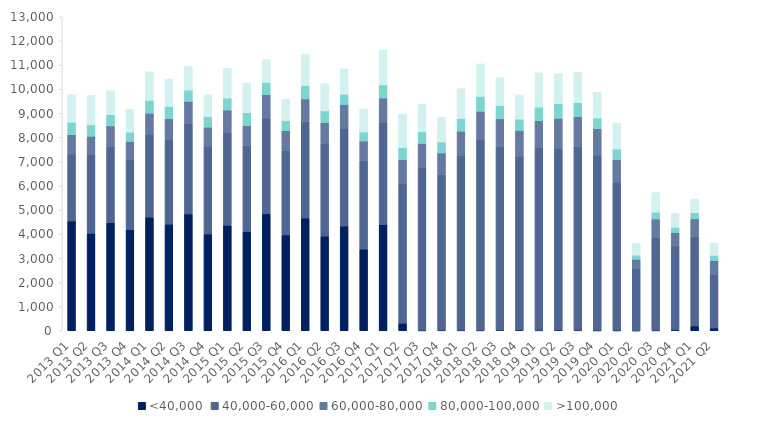
| Category | <40,000 | 40,000-60,000 | 60,000-80,000 | 80,000-100,000 | >100,000 |
|---|---|---|---|---|---|
| 2013 Q1 | 4539 | 2784 | 792 | 522 | 1130 |
| 2013 Q2 | 4029 | 3262 | 762 | 474 | 1214 |
| 2013 Q3 | 4469 | 3155 | 859 | 461 | 993 |
| 2013 Q4 | 4182 | 2926 | 733 | 384 | 938 |
| 2014 Q1 | 4702 | 3444 | 866 | 531 | 1184 |
| 2014 Q2 | 4406 | 3522 | 856 | 504 | 1136 |
| 2014 Q3 | 4838 | 3768 | 891 | 467 | 973 |
| 2014 Q4 | 4002 | 3643 | 787 | 430 | 910 |
| 2015 Q1 | 4361 | 3860 | 920 | 493 | 1237 |
| 2015 Q2 | 4105 | 3554 | 837 | 536 | 1217 |
| 2015 Q3 | 4839 | 3973 | 965 | 506 | 943 |
| 2015 Q4 | 3967 | 3500 | 817 | 409 | 888 |
| 2016 Q1 | 4662 | 3993 | 943 | 554 | 1287 |
| 2016 Q2 | 3912 | 3835 | 879 | 478 | 1119 |
| 2016 Q3 | 4328 | 4033 | 1008 | 424 | 1047 |
| 2016 Q4 | 3373 | 3675 | 808 | 371 | 956 |
| 2017 Q1 | 4392 | 4241 | 1005 | 542 | 1430 |
| 2017 Q2 | 307 | 5774 | 1000 | 505 | 1391 |
| 2017 Q3 | 12 | 6771 | 973 | 488 | 1130 |
| 2017 Q4 | 17 | 6437 | 909 | 454 | 1028 |
| 2018 Q1 | 17 | 7253 | 994 | 516 | 1244 |
| 2018 Q2 | 13 | 7914 | 1160 | 616 | 1347 |
| 2018 Q3 | 20 | 7612 | 1143 | 551 | 1153 |
| 2018 Q4 | 26 | 7209 | 1062 | 468 | 1001 |
| 2019 Q1 | 16 | 7570 | 1108 | 570 | 1408 |
| 2019 Q2 | 25 | 7529 | 1243 | 613 | 1236 |
| 2019 Q3 | 20 | 7597 | 1251 | 576 | 1266 |
| 2019 Q4 | 10 | 7269 | 1087 | 444 | 1064 |
| 2020 Q1 | 10 | 6147 | 928 | 437 | 1076 |
| 2020 Q2 | 5 | 2572 | 382 | 172 | 478 |
| 2020 Q3 | 11 | 3853 | 764 | 282 | 807 |
| 2020 Q4 | 33 | 3483 | 546 | 223 | 570 |
| 2021 Q1 | 196 | 3700 | 738 | 251 | 570 |
| 2021 Q2 | 112 | 2224 | 565 | 225 | 505 |